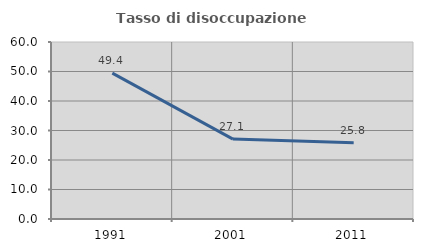
| Category | Tasso di disoccupazione giovanile  |
|---|---|
| 1991.0 | 49.444 |
| 2001.0 | 27.083 |
| 2011.0 | 25.806 |